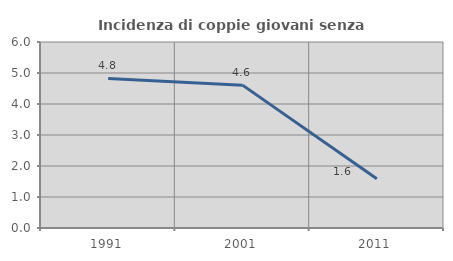
| Category | Incidenza di coppie giovani senza figli |
|---|---|
| 1991.0 | 4.825 |
| 2001.0 | 4.608 |
| 2011.0 | 1.587 |